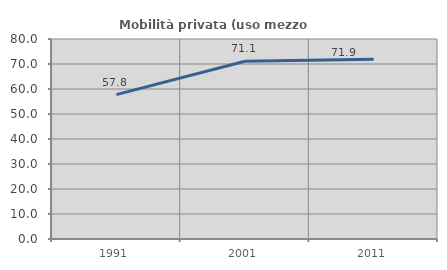
| Category | Mobilità privata (uso mezzo privato) |
|---|---|
| 1991.0 | 57.76 |
| 2001.0 | 71.12 |
| 2011.0 | 71.908 |